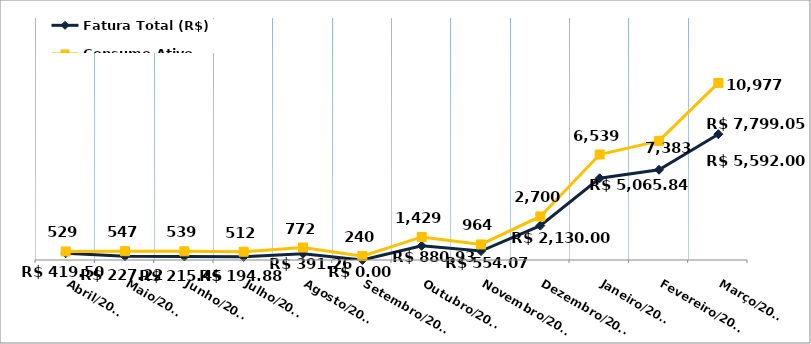
| Category | Fatura Total (R$) |
|---|---|
| Abril/2023 | 419.5 |
| Maio/2023 | 227.22 |
| Junho/2023 | 215.45 |
| Julho/2023 | 194.88 |
| Agosto/2023 | 391.26 |
| Setembro/2023 | 0 |
| Outubro/2023 | 880.93 |
| Novembro/2023 | 554.07 |
| Dezembro/2023 | 2130 |
| Janeiro/2024 | 5065.84 |
| Fevereiro/2024 | 5592 |
| Março/2024 | 7799.05 |